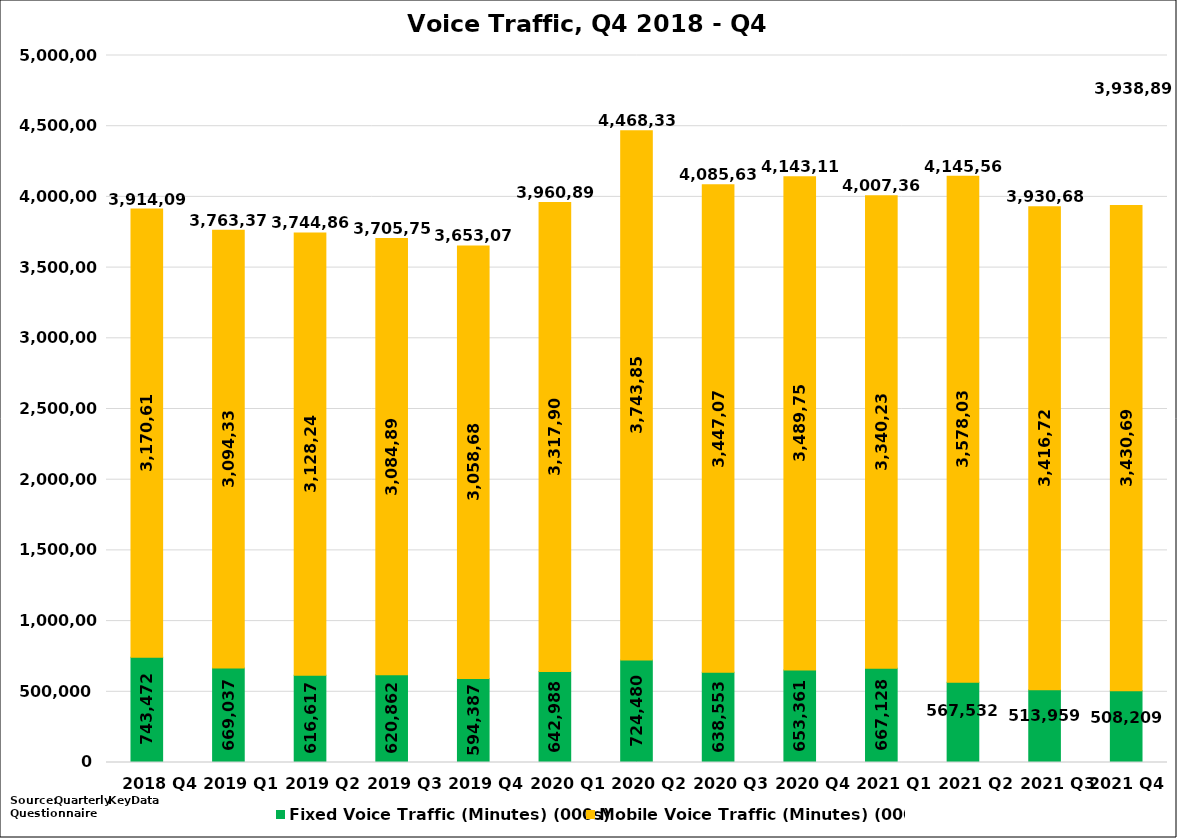
| Category | Fixed Voice Traffic (Minutes) (000s) | Mobile Voice Traffic (Minutes) (000s) | Total Voice Traffic (Minutes) (000s) |
|---|---|---|---|
| 2018 Q4 | 743472.478 | 3170618.882 | 3914091.36 |
| 2019 Q1 | 669036.816 | 3094332.692 | 3763369.508 |
| 2019 Q2 | 616616.925 | 3128245.304 | 3744862.229 |
| 2019 Q3 | 620861.947 | 3084892.681 | 3705754.628 |
| 2019 Q4 | 594387.173 | 3058682.507 | 3653069.68 |
| 2020 Q1 | 642988 | 3317905.957 | 3960893.957 |
| 2020 Q2 | 724479.867 | 3743853.177 | 4468333.044 |
| 2020 Q3 | 638552.857 | 3447078.57 | 4085631.427 |
| 2020 Q4 | 653361.114 | 3489753.623 | 4143114.737 |
| 2021 Q1 | 667128.48 | 3340235.601 | 4007364.082 |
| 2021 Q2 | 567531.791 | 3578036.277 | 4145568.068 |
| 2021 Q3 | 513959 | 3416725.853 | 3930684.853 |
| 2021 Q4  | 508209.225 | 3430689.894 | 3938899.119 |